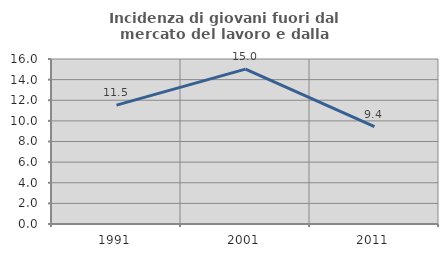
| Category | Incidenza di giovani fuori dal mercato del lavoro e dalla formazione  |
|---|---|
| 1991.0 | 11.522 |
| 2001.0 | 15.022 |
| 2011.0 | 9.435 |